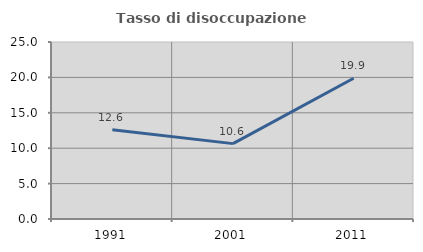
| Category | Tasso di disoccupazione giovanile  |
|---|---|
| 1991.0 | 12.615 |
| 2001.0 | 10.646 |
| 2011.0 | 19.883 |